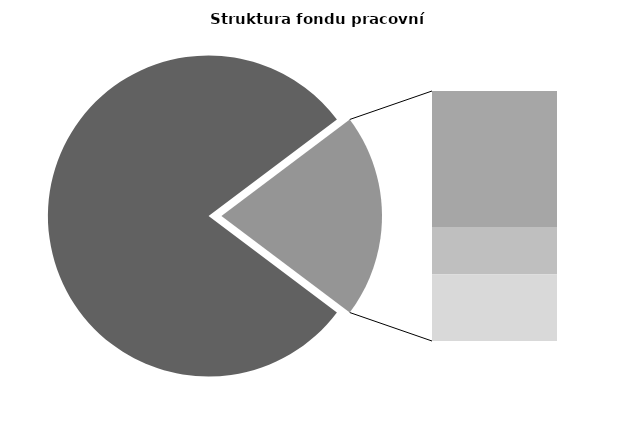
| Category | Series 0 |
|---|---|
| Průměrná měsíční odpracovaná doba bez přesčasu | 136.838 |
| Dovolená | 19.224 |
| Nemoc | 6.698 |
| Jiné | 9.426 |